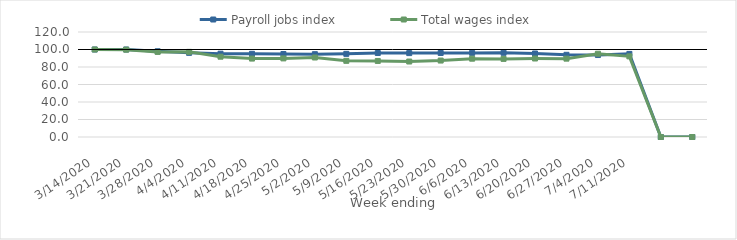
| Category | Payroll jobs index | Total wages index |
|---|---|---|
| 14/03/2020 | 100 | 100 |
| 21/03/2020 | 99.991 | 99.808 |
| 28/03/2020 | 98.006 | 97.248 |
| 04/04/2020 | 96.165 | 97.293 |
| 11/04/2020 | 95.209 | 91.783 |
| 18/04/2020 | 95.066 | 89.621 |
| 25/04/2020 | 94.825 | 89.825 |
| 02/05/2020 | 94.658 | 90.846 |
| 09/05/2020 | 95.028 | 87.046 |
| 16/05/2020 | 95.97 | 86.922 |
| 23/05/2020 | 95.86 | 86.262 |
| 30/05/2020 | 96.019 | 87.363 |
| 06/06/2020 | 96.131 | 89.486 |
| 13/06/2020 | 96.221 | 89.252 |
| 20/06/2020 | 95.455 | 89.714 |
| 27/06/2020 | 93.924 | 89.548 |
| 04/07/2020 | 93.673 | 95.163 |
| 11/07/2020 | 94.963 | 92.148 |